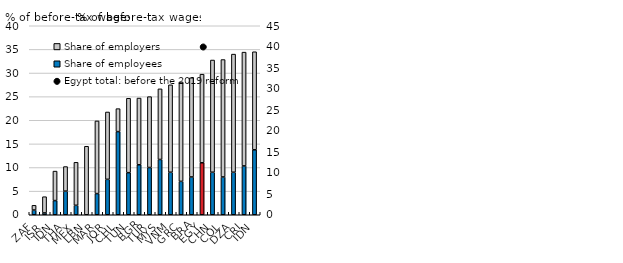
| Category | Share of employees | Share of employers |
|---|---|---|
| ZAF | 1 | 1 |
| ISR | 0.39 | 3.43 |
| IDN | 3 | 6.24 |
| THA | 5 | 5.2 |
| MEX | 2 | 9.1 |
| LBN | 0 | 14.5 |
| MAR | 4.48 | 15.38 |
| JOR | 7.5 | 14.25 |
| CHL | 17.6 | 4.86 |
| TUN | 8.911 | 15.739 |
| BGR | 10.58 | 14.12 |
| TUR | 10 | 15 |
| MYS | 11.7 | 14.95 |
| VNM | 9 | 18.5 |
| GRC | 7.07 | 21.05 |
| BRA | 8 | 21 |
| EGY | 11 | 18.75 |
| CHN | 9 | 23.75 |
| COL | 8 | 24.848 |
| DZA | 9 | 25 |
| CRI | 10.34 | 24.08 |
| IDN | 13.75 | 20.75 |